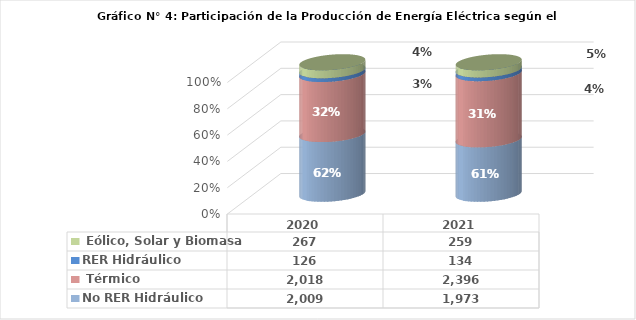
| Category | No RER | RER |
|---|---|---|
| 2020.0 | 2018.458 | 267.275 |
| 2021.0 | 2396.487 | 259.135 |